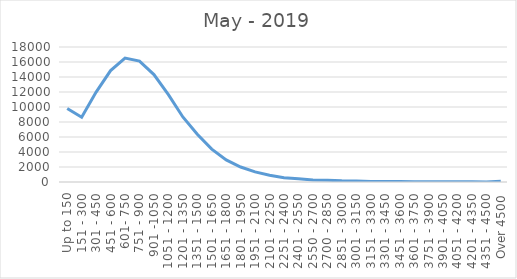
| Category | May - 2019 |
|---|---|
| Up to 150 | 9812 |
| 151 - 300 | 8638 |
| 301 - 450 | 11985 |
| 451 - 600 | 14850 |
| 601- 750 | 16523 |
| 751 - 900 | 16115 |
| 901 -1050 | 14321 |
| 1051 - 1200 | 11642 |
| 1201 - 1350 | 8674 |
| 1351 - 1500 | 6364 |
| 1501 - 1650 | 4385 |
| 1651 - 1800 | 2939 |
| 1801 - 1950 | 2000 |
| 1951 - 2100 | 1345 |
| 2101 - 2250 | 908 |
| 2251 - 2400 | 581 |
| 2401 - 2550 | 438 |
| 2550 - 2700 | 278 |
| 2700 - 2850 | 229 |
| 2851 - 3000 | 159 |
| 3001 - 3150 | 132 |
| 3151 - 3300 | 67 |
| 3301 - 3450 | 65 |
| 3451 - 3600 | 59 |
| 3601 - 3750 | 38 |
| 3751 - 3900 | 33 |
| 3901 - 4050 | 29 |
| 4051 - 4200 | 23 |
| 4201 - 4350 | 19 |
| 4351 - 4500 | 15 |
| Over 4500 | 107 |